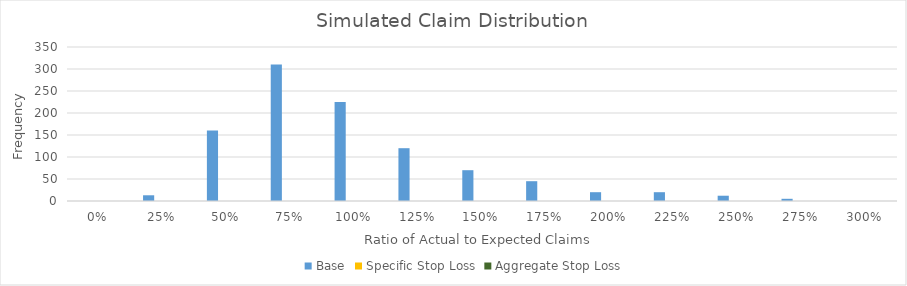
| Category | Base | Specific Stop Loss | Aggregate Stop Loss |
|---|---|---|---|
| 0.0 | 0 |  |  |
| 0.25 | 13 |  |  |
| 0.5 | 160 |  |  |
| 0.75 | 310 |  |  |
| 1.0 | 225 |  |  |
| 1.25 | 120 |  |  |
| 1.5 | 70 |  |  |
| 1.75 | 45 |  |  |
| 2.0 | 20 |  |  |
| 2.25 | 20 |  |  |
| 2.5 | 12 |  |  |
| 2.75 | 5 |  |  |
| 3.0 | 0 |  |  |